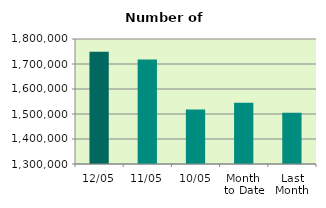
| Category | Series 0 |
|---|---|
| 12/05 | 1748806 |
| 11/05 | 1718258 |
| 10/05 | 1518482 |
| Month 
to Date | 1544846 |
| Last
Month | 1505043.474 |